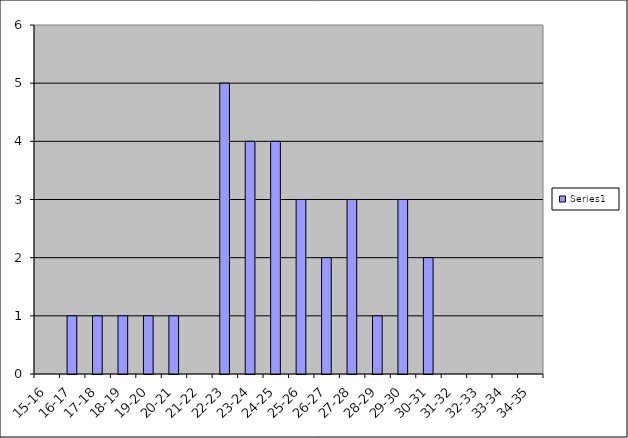
| Category | Series 0 |
|---|---|
| 15-16 | 0 |
| 16-17 | 1 |
| 17-18 | 1 |
| 18-19 | 1 |
| 19-20 | 1 |
| 20-21 | 1 |
| 21-22 | 0 |
| 22-23 | 5 |
| 23-24 | 4 |
| 24-25 | 4 |
| 25-26 | 3 |
| 26-27 | 2 |
| 27-28 | 3 |
| 28-29 | 1 |
| 29-30 | 3 |
| 30-31 | 2 |
| 31-32 | 0 |
| 32-33 | 0 |
| 33-34 | 0 |
| 34-35 | 0 |